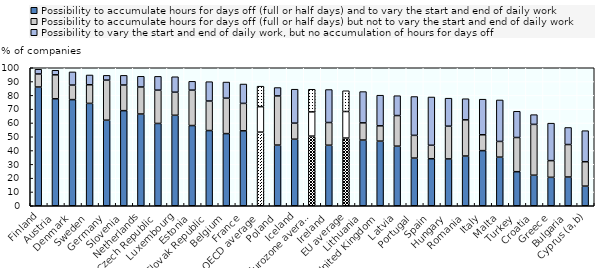
| Category | Possibility to accumulate hours for days off (full or half days) and to vary the start and end of daily work | Possibility to accumulate hours for days off (full or half days) but not to vary the start and end of daily work | Possibility to vary the start and end of daily work, but no accumulation of hours for days off |
|---|---|---|---|
| Finland | 86.05 | 9.447 | 3.414 |
| Austria | 77.504 | 17.376 | 3.302 |
| Denmark | 76.913 | 10.536 | 9.549 |
| Sweden | 74.178 | 13.494 | 7.09 |
| Germany | 62.002 | 29.038 | 3.455 |
| Slovenia | 68.91 | 18.581 | 7.001 |
| Netherlands | 66.481 | 19.592 | 7.743 |
| Czech Republic | 59.638 | 24.145 | 9.987 |
| Luxembourg | 65.567 | 16.723 | 11.188 |
| Estonia | 58.128 | 25.657 | 6.383 |
| Slovak Republic | 54.491 | 21.409 | 14.007 |
| Belgium | 52.281 | 25.684 | 11.682 |
| France | 54.292 | 19.887 | 14.025 |
| OECD average | 53.353 | 18.465 | 14.821 |
| Poland | 43.973 | 35.635 | 6.057 |
| Iceland | 48.226 | 11.64 | 24.599 |
| Eurozone average | 50.472 | 17.545 | 16.407 |
| Ireland | 43.865 | 16.442 | 23.9 |
| EU average | 49.052 | 19.234 | 15.057 |
| Lithuania | 47.621 | 12.446 | 22.664 |
| United Kingdom | 46.831 | 11.092 | 22.187 |
| Latvia | 43.173 | 22.182 | 14.392 |
| Portugal | 34.537 | 16.475 | 28.135 |
| Spain | 34.07 | 9.762 | 34.978 |
| Hungary | 33.938 | 23.729 | 20.283 |
| Romania | 36.037 | 26.236 | 15.276 |
| Italy | 39.955 | 11.486 | 25.78 |
| Malta | 35.227 | 11.382 | 30.059 |
| Turkey | 24.694 | 24.754 | 19.008 |
| Croatia | 22.141 | 36.818 | 7.051 |
| Greece | 20.597 | 12.11 | 27.138 |
| Bulgaria | 20.829 | 23.524 | 12.368 |
| Cyprus (a,b) | 14.225 | 17.676 | 22.492 |